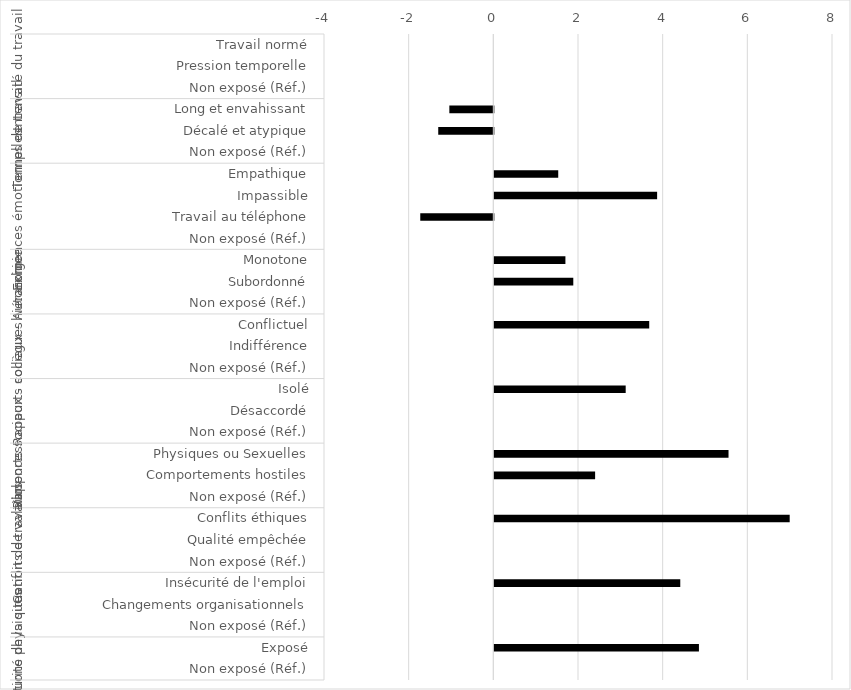
| Category | Model 2 (MCO) |
|---|---|
| 0 | 0 |
| 1 | 0 |
| 2 | 0 |
| 3 | -1.039 |
| 4 | -1.301 |
| 5 | 0 |
| 6 | 1.509 |
| 7 | 3.845 |
| 8 | -1.726 |
| 9 | 0 |
| 10 | 1.679 |
| 11 | 1.865 |
| 12 | 0 |
| 13 | 3.659 |
| 14 | 0 |
| 15 | 0 |
| 16 | 3.103 |
| 17 | 0 |
| 18 | 0 |
| 19 | 5.532 |
| 20 | 2.381 |
| 21 | 0 |
| 22 | 6.977 |
| 23 | 0 |
| 24 | 0 |
| 25 | 4.392 |
| 26 | 0 |
| 27 | 0 |
| 28 | 4.833 |
| 29 | 0 |